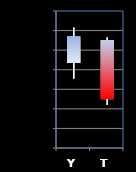
| Category | Series 0 | Series 1 | Series 2 | Series 3 |
|---|---|---|---|---|
| Y | 731.75 | 740.75 | 727.75 | 738.5 |
| T | 737.5 | 738.25 | 721 | 722.5 |